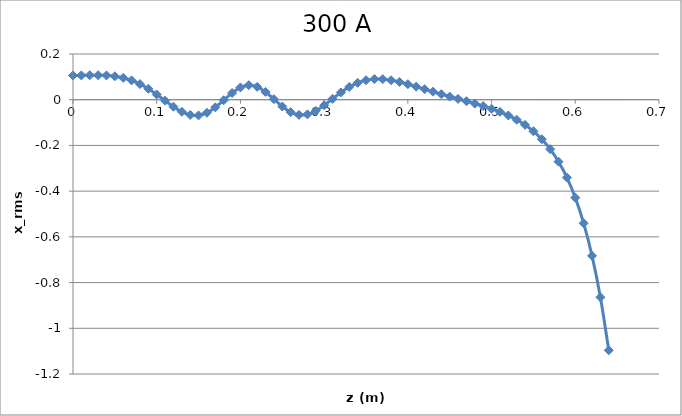
| Category | Series 0 |
|---|---|
| 0.0 | 0.106 |
| 0.01 | 0.106 |
| 0.02 | 0.107 |
| 0.03 | 0.107 |
| 0.04 | 0.106 |
| 0.05 | 0.102 |
| 0.06 | 0.096 |
| 0.07 | 0.084 |
| 0.08 | 0.069 |
| 0.09 | 0.048 |
| 0.1 | 0.023 |
| 0.11 | -0.004 |
| 0.12 | -0.031 |
| 0.13 | -0.053 |
| 0.14 | -0.067 |
| 0.15 | -0.069 |
| 0.16 | -0.057 |
| 0.17 | -0.033 |
| 0.18 | -0.002 |
| 0.19 | 0.03 |
| 0.2 | 0.054 |
| 0.21 | 0.063 |
| 0.22 | 0.056 |
| 0.23 | 0.034 |
| 0.24 | 0.002 |
| 0.25 | -0.03 |
| 0.26 | -0.054 |
| 0.27 | -0.067 |
| 0.28 | -0.064 |
| 0.29 | -0.049 |
| 0.3 | -0.025 |
| 0.31 | 0.004 |
| 0.32 | 0.032 |
| 0.33 | 0.056 |
| 0.34 | 0.074 |
| 0.35 | 0.085 |
| 0.36 | 0.09 |
| 0.37 | 0.09 |
| 0.38 | 0.085 |
| 0.39 | 0.078 |
| 0.4 | 0.068 |
| 0.41 | 0.057 |
| 0.42 | 0.046 |
| 0.43 | 0.035 |
| 0.44 | 0.024 |
| 0.45 | 0.014 |
| 0.46 | 0.004 |
| 0.47 | -0.007 |
| 0.48 | -0.017 |
| 0.49 | -0.028 |
| 0.5 | -0.04 |
| 0.51 | -0.053 |
| 0.52 | -0.069 |
| 0.53 | -0.087 |
| 0.54 | -0.11 |
| 0.55 | -0.138 |
| 0.56 | -0.173 |
| 0.57 | -0.216 |
| 0.58 | -0.271 |
| 0.59 | -0.341 |
| 0.6 | -0.429 |
| 0.61 | -0.54 |
| 0.62 | -0.683 |
| 0.63 | -0.864 |
| 0.64 | -1.096 |